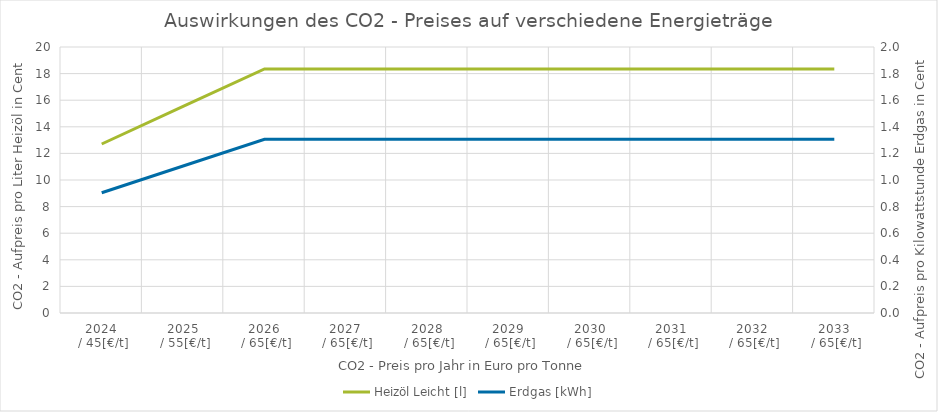
| Category | Heizöl Leicht [l] |
|---|---|
| 2024
 / 45[€/t] | 12.707 |
| 2025
 / 55[€/t] | 15.531 |
| 2026
 / 65[€/t] | 18.355 |
| 2027
 / 65[€/t] | 18.355 |
| 2028
 / 65[€/t] | 18.355 |
| 2029
 / 65[€/t] | 18.355 |
| 2030
 / 65[€/t] | 18.355 |
| 2031
 / 65[€/t] | 18.355 |
| 2032
 / 65[€/t] | 18.355 |
| 2033
 / 65[€/t] | 18.355 |